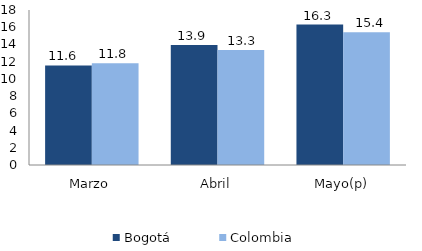
| Category | Bogotá | Colombia |
|---|---|---|
| Marzo | 11.555 | 11.824 |
| Abril | 13.94 | 13.341 |
| Mayo(p) | 16.305 | 15.428 |